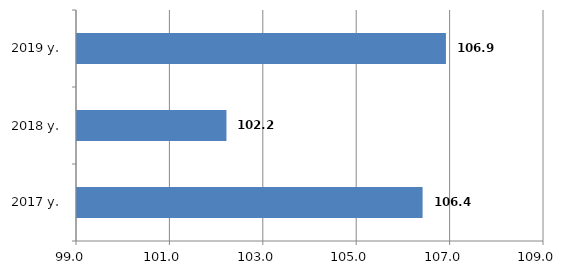
| Category | Series 0 |
|---|---|
| 2017 y. | 106.4 |
| 2018 y. | 102.2 |
| 2019 y. | 106.9 |